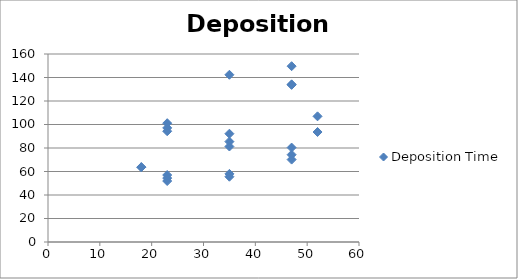
| Category | Deposition Time |
|---|---|
| 18.0 | 63.717 |
| 35.0 | 85.445 |
| 52.0 | 106.945 |
| 52.0 | 93.613 |
| 18.0 | 63.649 |
| 35.0 | 81.263 |
| 35.0 | 55.567 |
| 35.0 | 92.158 |
| 23.0 | 56.995 |
| 23.0 | 51.887 |
| 47.0 | 80.358 |
| 47.0 | 74.308 |
| 47.0 | 70.144 |
| 23.0 | 54.406 |
| 23.0 | 97.1 |
| 23.0 | 101.104 |
| 23.0 | 94.277 |
| 47.0 | 134.174 |
| 47.0 | 133.72 |
| 47.0 | 149.627 |
| 35.0 | 142.321 |
| 35.0 | 57.991 |